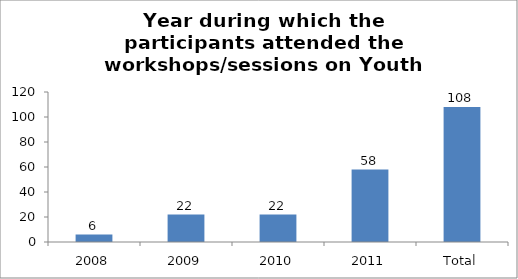
| Category | Year during which the participants attended the workshops/sessions on Youth Social Entrepreneurship |
|---|---|
| 2008 | 6 |
| 2009 | 22 |
| 2010 | 22 |
| 2011 | 58 |
| Total | 108 |